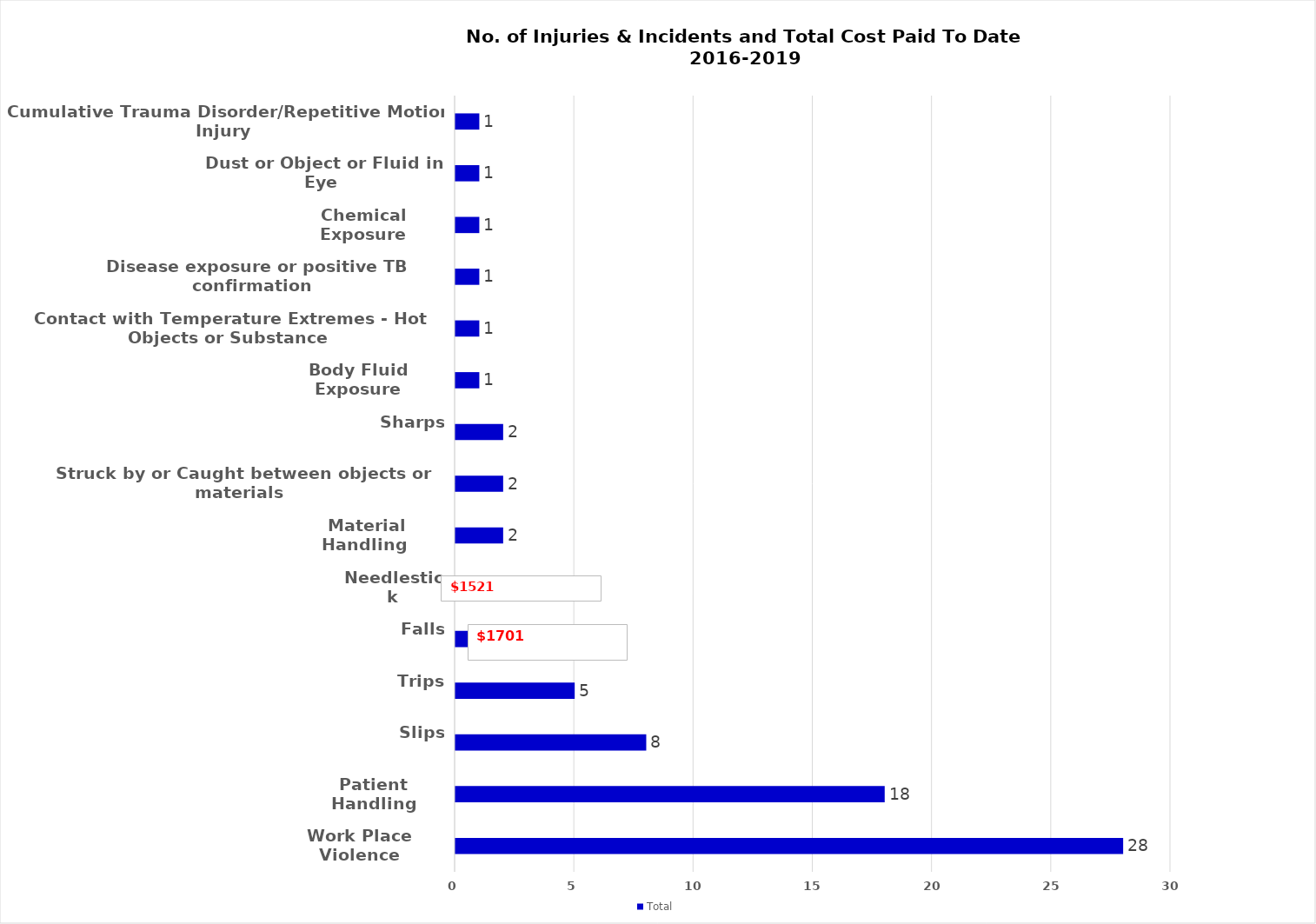
| Category | Total |
|---|---|
| Work Place Violence | 28 |
| Patient Handling | 18 |
| Slips, Trips, Falls | 8 |
| Needlestick | 5 |
| Material Handling  | 5 |
| Struck by or Caught between objects or materials | 4 |
| Sharps | 2 |
| Body Fluid Exposure | 2 |
| Contact with Temperature Extremes - Hot Objects or Substance | 2 |
| Disease exposure or positive TB confirmation  | 1 |
| Chemical Exposure | 1 |
| Dust or Object or Fluid in Eye | 1 |
| Cumulative Trauma Disorder/Repetitive Motion Injury | 1 |
| Overexertion -general | 1 |
| Motor Vehicle Accident/Incident | 1 |